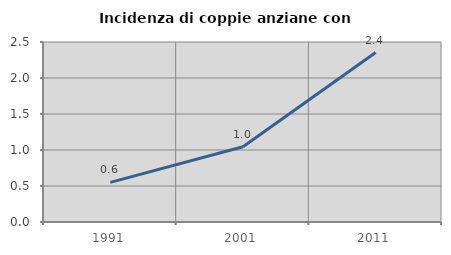
| Category | Incidenza di coppie anziane con figli |
|---|---|
| 1991.0 | 0.551 |
| 2001.0 | 1.046 |
| 2011.0 | 2.353 |